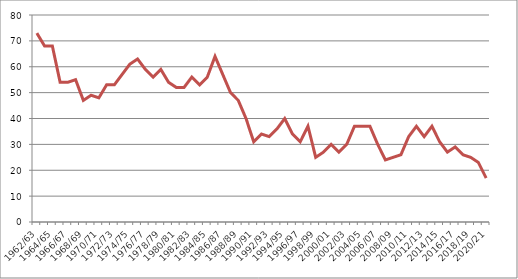
| Category | Series 0 |
|---|---|
| 1962/63 | 73 |
| 1963/64 | 68 |
| 1964/65 | 68 |
| 1965/66 | 54 |
| 1966/67 | 54 |
| 1967/68 | 55 |
| 1968/69 | 47 |
| 1969/70 | 49 |
| 1970/71 | 48 |
| 1971/72 | 53 |
| 1972/73 | 53 |
| 1973/74 | 57 |
| 1974/75 | 61 |
| 1975/76 | 63 |
| 1976/77 | 59 |
| 1977/78 | 56 |
| 1978/79 | 59 |
| 1979/80 | 54 |
| 1980/81 | 52 |
| 1981/82 | 52 |
| 1982/83 | 56 |
| 1983/84 | 53 |
| 1984/85 | 56 |
| 1985/86 | 64 |
| 1986/87 | 57 |
| 1987/88 | 50 |
| 1988/89 | 47 |
| 1989/90 | 40 |
| 1990/91 | 31 |
| 1991/92 | 34 |
| 1992/93 | 33 |
| 1993/94 | 36 |
| 1994/95 | 40 |
| 1995/96 | 34 |
| 1996/97 | 31 |
| 1997/98 | 37 |
| 1998/99 | 25 |
| 1999/00 | 27 |
| 2000/01 | 30 |
| 2001/02 | 27 |
| 2002/03 | 30 |
| 2003/04 | 37 |
| 2004/05 | 37 |
| 2005/06 | 37 |
| 2006/07 | 30 |
| 2007/08 | 24 |
| 2008/09 | 25 |
| 2009/10 | 26 |
| 2010/11 | 33 |
| 2011/12 | 37 |
| 2012/13 | 33 |
| 2013/14 | 37 |
| 2014/15 | 31 |
| 2015/16 | 27 |
| 2016/17 | 29 |
| 2017/18 | 26 |
| 2018/19 | 25 |
| 2019/20 | 23 |
| 2020/21 | 17 |